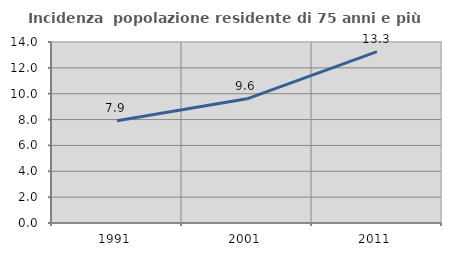
| Category | Incidenza  popolazione residente di 75 anni e più |
|---|---|
| 1991.0 | 7.912 |
| 2001.0 | 9.606 |
| 2011.0 | 13.251 |